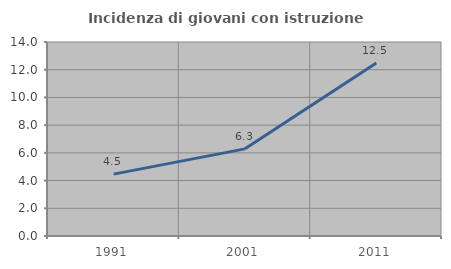
| Category | Incidenza di giovani con istruzione universitaria |
|---|---|
| 1991.0 | 4.464 |
| 2001.0 | 6.288 |
| 2011.0 | 12.481 |